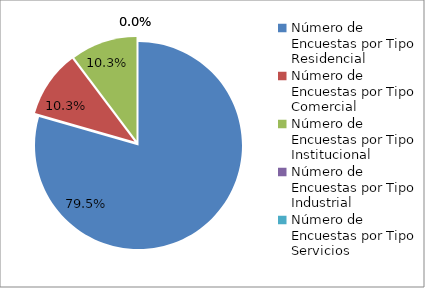
| Category | Series 0 |
|---|---|
| 0 | 116 |
| 1 | 15 |
| 2 | 15 |
| 3 | 0 |
| 4 | 0 |